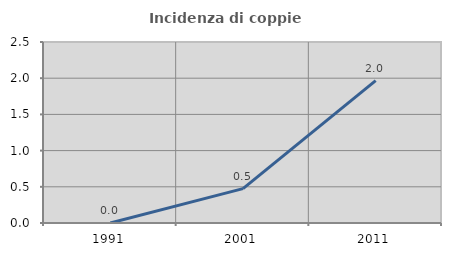
| Category | Incidenza di coppie miste |
|---|---|
| 1991.0 | 0 |
| 2001.0 | 0.475 |
| 2011.0 | 1.966 |